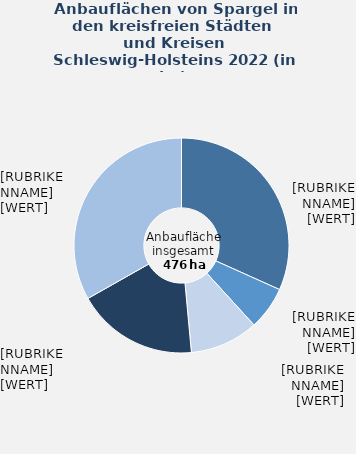
| Category | Spargel |
|---|---|
| Herzogtum Lauenburg | 151 |
| Ostholstein | 31 |
| Rendsburg-Eckernförde | 49 |
| Segeberg | 87 |
| übrige kreisfreie Städte und Kreise | 158 |